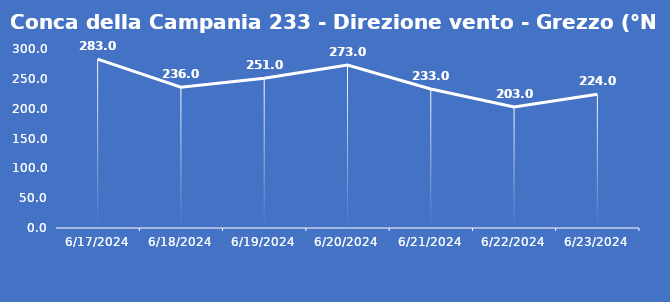
| Category | Conca della Campania 233 - Direzione vento - Grezzo (°N) |
|---|---|
| 6/17/24 | 283 |
| 6/18/24 | 236 |
| 6/19/24 | 251 |
| 6/20/24 | 273 |
| 6/21/24 | 233 |
| 6/22/24 | 203 |
| 6/23/24 | 224 |